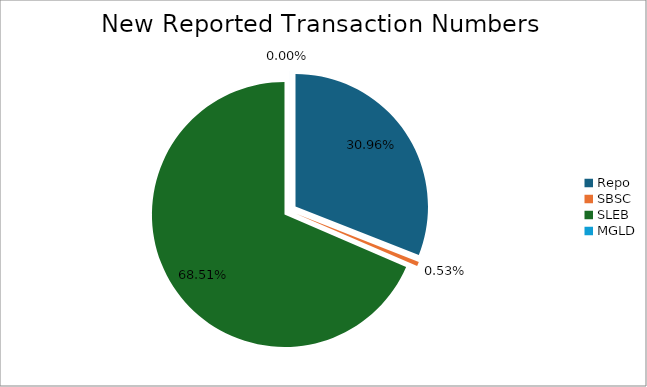
| Category | Series 0 |
|---|---|
| Repo | 365037 |
| SBSC | 6289 |
| SLEB | 807714 |
| MGLD | 15 |